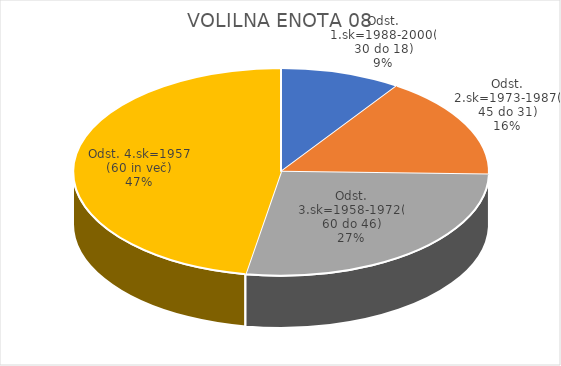
| Category | VOLILNA ENOTA 08 |
|---|---|
| Odst. 1.sk=1988-2000(30 do 18) | 2.28 |
| Odst. 2.sk=1973-1987(45 do 31) | 3.86 |
| Odst. 3.sk=1958-1972(60 do 46) | 6.61 |
| Odst. 4.sk=1957 (60 in več) | 11.43 |